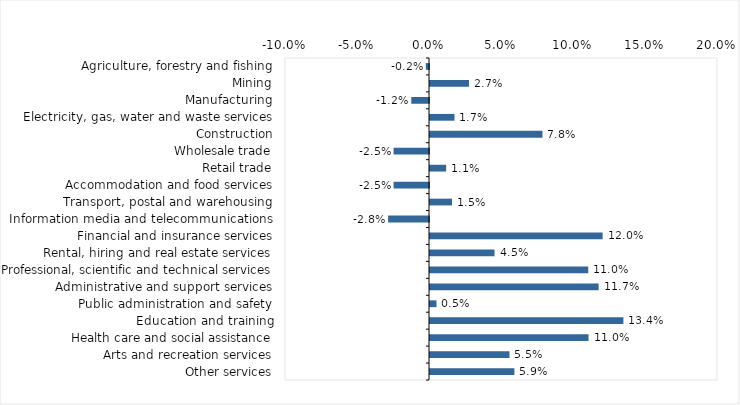
| Category | This week |
|---|---|
| Agriculture, forestry and fishing | -0.002 |
| Mining | 0.027 |
| Manufacturing | -0.012 |
| Electricity, gas, water and waste services | 0.017 |
| Construction | 0.078 |
| Wholesale trade | -0.025 |
| Retail trade | 0.011 |
| Accommodation and food services | -0.025 |
| Transport, postal and warehousing | 0.015 |
| Information media and telecommunications | -0.028 |
| Financial and insurance services | 0.12 |
| Rental, hiring and real estate services | 0.045 |
| Professional, scientific and technical services | 0.11 |
| Administrative and support services | 0.117 |
| Public administration and safety | 0.004 |
| Education and training | 0.134 |
| Health care and social assistance | 0.11 |
| Arts and recreation services | 0.055 |
| Other services | 0.059 |